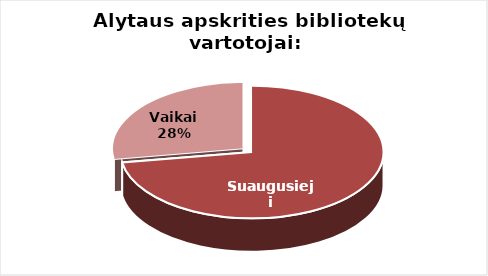
| Category | Series 0 |
|---|---|
| Suaugusieji | 31626 |
| Vaikai | 12015 |